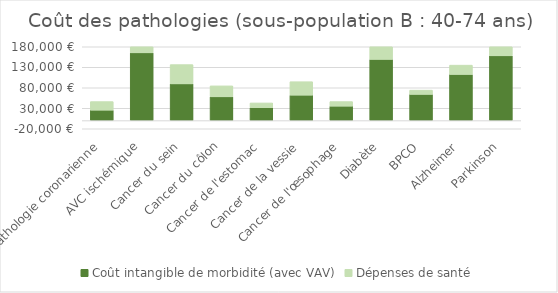
| Category | Coût intangible de morbidité (avec VAV) | Dépenses de santé |
|---|---|---|
| Pathologie coronarienne | 25382.399 | 20937.832 |
| AVC ischémique | 165209.185 | 38946.327 |
| Cancer du sein | 89550.357 | 46968.352 |
| Cancer du côlon | 57936.743 | 26715.952 |
| Cancer de l'estomac | 31321.349 | 11709.74 |
| Cancer de la vessie | 61961.456 | 32837.637 |
| Cancer de l'œsophage | 35133.005 | 11180.657 |
| Diabète | 149196.155 | 36514.117 |
| BPCO | 63852.699 | 10405.406 |
| Alzheimer | 112506.023 | 22747.957 |
| Parkinson | 157906.422 | 32152.452 |